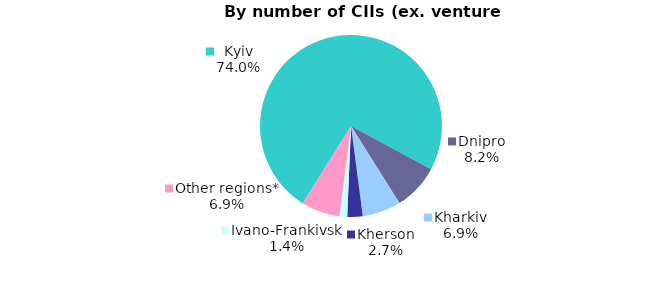
| Category | Series 0 |
|---|---|
| Kyiv | 0.74 |
| Dnipro | 0.082 |
| Kharkiv | 0.068 |
| Kherson | 0.027 |
| Ivano-Frankivsk | 0.014 |
| Other regions* | 0.068 |